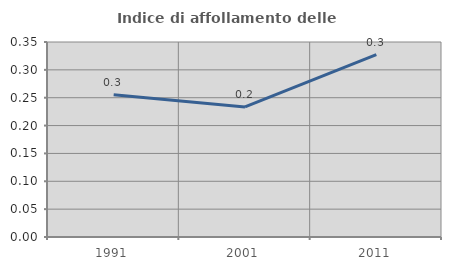
| Category | Indice di affollamento delle abitazioni  |
|---|---|
| 1991.0 | 0.255 |
| 2001.0 | 0.233 |
| 2011.0 | 0.328 |